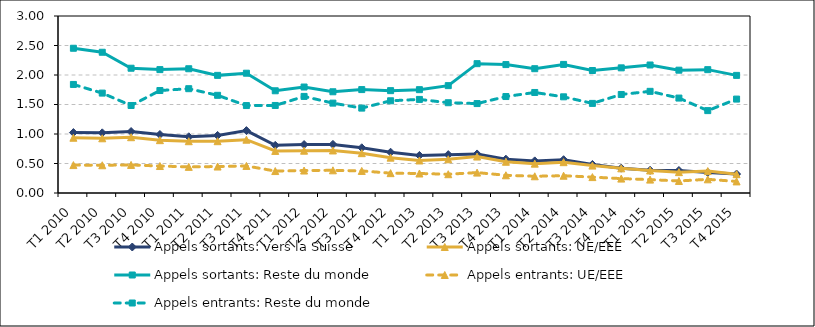
| Category | Appels sortants: vers la Suisse | Appels sortants: UE/EEE | Appels sortants: Reste du monde | Appels entrants: UE/EEE | Appels entrants: Reste du monde |
|---|---|---|---|---|---|
| T1 2010 | 1.024 | 0.937 | 2.453 | 0.473 | 1.84 |
| T2 2010 | 1.02 | 0.927 | 2.385 | 0.47 | 1.693 |
| T3 2010 | 1.042 | 0.946 | 2.115 | 0.476 | 1.483 |
| T4 2010 | 0.992 | 0.896 | 2.091 | 0.457 | 1.737 |
| T1 2011 | 0.953 | 0.878 | 2.106 | 0.443 | 1.768 |
| T2 2011 | 0.976 | 0.878 | 1.994 | 0.449 | 1.656 |
| T3 2011 | 1.058 | 0.903 | 2.03 | 0.459 | 1.482 |
| T4 2011 | 0.808 | 0.713 | 1.733 | 0.372 | 1.484 |
| T1 2012 | 0.821 | 0.717 | 1.796 | 0.381 | 1.637 |
| T2 2012 | 0.824 | 0.721 | 1.716 | 0.384 | 1.523 |
| T3 2012 | 0.767 | 0.675 | 1.753 | 0.374 | 1.439 |
| T4 2012 | 0.691 | 0.599 | 1.735 | 0.336 | 1.563 |
| T1 2013 | 0.637 | 0.551 | 1.751 | 0.331 | 1.586 |
| T2 2013 | 0.65 | 0.571 | 1.82 | 0.318 | 1.53 |
| T3 2013 | 0.662 | 0.618 | 2.192 | 0.346 | 1.516 |
| T4 2013 | 0.573 | 0.53 | 2.177 | 0.3 | 1.635 |
| T1 2014 | 0.544 | 0.498 | 2.107 | 0.284 | 1.704 |
| T2 2014 | 0.565 | 0.522 | 2.179 | 0.293 | 1.63 |
| T3 2014 | 0.484 | 0.465 | 2.076 | 0.269 | 1.519 |
| T4 2014 | 0.421 | 0.418 | 2.121 | 0.244 | 1.67 |
| T1 2015 | 0.385 | 0.382 | 2.17 | 0.227 | 1.723 |
| T2 2015 | 0.382 | 0.354 | 2.082 | 0.204 | 1.609 |
| T3 2015 | 0.349 | 0.372 | 2.091 | 0.232 | 1.396 |
| T4 2015 | 0.321 | 0.319 | 1.994 | 0.196 | 1.592 |